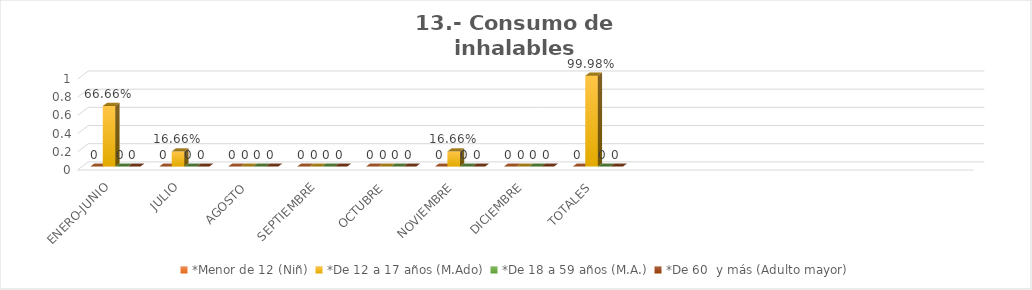
| Category | *Menor de 12 (Niñ) | *De 12 a 17 años (M.Ado) | *De 18 a 59 años (M.A.) | *De 60  y más (Adulto mayor) |
|---|---|---|---|---|
| ENERO-JUNIO | 0 | 0.667 | 0 | 0 |
| JULIO | 0 | 0.167 | 0 | 0 |
| AGOSTO | 0 | 0 | 0 | 0 |
| SEPTIEMBRE | 0 | 0 | 0 | 0 |
| OCTUBRE | 0 | 0 | 0 | 0 |
| NOVIEMBRE | 0 | 0.167 | 0 | 0 |
| DICIEMBRE | 0 | 0 | 0 | 0 |
| TOTALES | 0 | 1 | 0 | 0 |